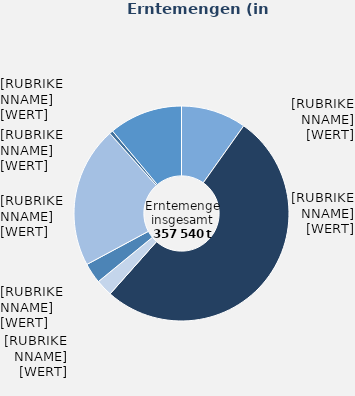
| Category | Erntemengen |
|---|---|
| Rotkohl | 35129 |
| Weißkohl | 184975 |
| Wirsing | 9001 |
| Blumenkohl | 10954 |
| Speisemöhren/ Karotten | 75931 |
| Spargel im Ertrag stehend | 1929 |
| Sonstige | 39621 |